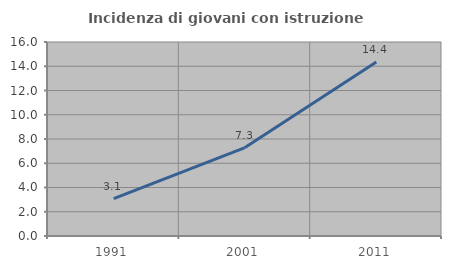
| Category | Incidenza di giovani con istruzione universitaria |
|---|---|
| 1991.0 | 3.077 |
| 2001.0 | 7.295 |
| 2011.0 | 14.36 |